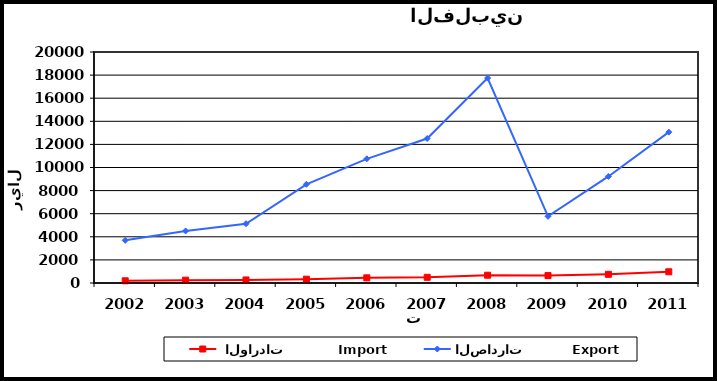
| Category |  الواردات           Import | الصادرات          Export |
|---|---|---|
| 2002.0 | 192 | 3694 |
| 2003.0 | 245 | 4505 |
| 2004.0 | 263 | 5130 |
| 2005.0 | 331 | 8544 |
| 2006.0 | 447 | 10751 |
| 2007.0 | 493 | 12510 |
| 2008.0 | 676 | 17742 |
| 2009.0 | 640 | 5773 |
| 2010.0 | 750 | 9226 |
| 2011.0 | 972 | 13064 |